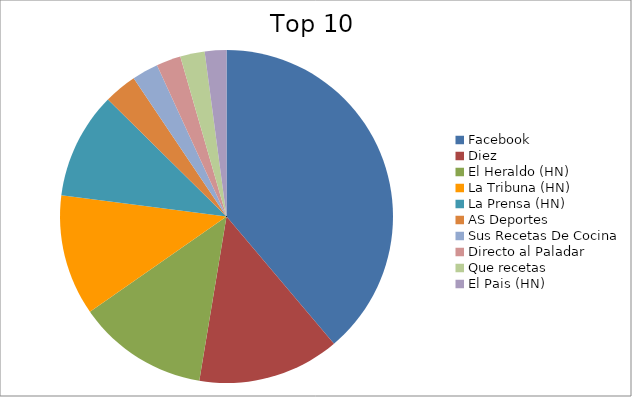
| Category | Series 0 |
|---|---|
| Facebook | 26.29 |
| Diez | 9.33 |
| El Heraldo (HN) | 8.59 |
| La Tribuna (HN) | 7.94 |
| La Prensa (HN) | 7.01 |
| AS Deportes | 2.17 |
| Sus Recetas De Cocina | 1.73 |
| Directo al Paladar | 1.61 |
| Que recetas | 1.61 |
| El Pais (HN) | 1.42 |